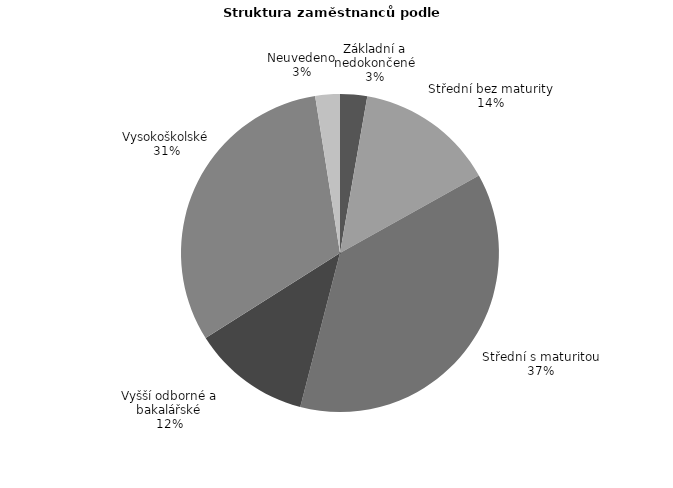
| Category | Series 0 |
|---|---|
| Základní a nedokončené | 18.148 |
| Střední bez maturity | 93.37 |
| Střední s maturitou | 244.824 |
| Vyšší odborné a bakalářské | 79.202 |
| Vysokoškolské | 207.591 |
| Neuvedeno | 16.5 |